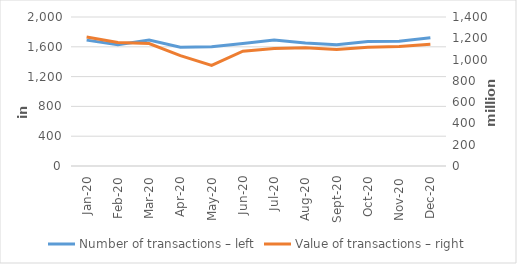
| Category | Number of transactions – left |
|---|---|
| 2020-01-01 | 1689658 |
| 2020-02-01 | 1628932 |
| 2020-03-01 | 1690846 |
| 2020-04-01 | 1593917 |
| 2020-05-01 | 1601244 |
| 2020-06-01 | 1645690 |
| 2020-07-01 | 1691157 |
| 2020-08-01 | 1649626 |
| 2020-09-01 | 1627483 |
| 2020-10-01 | 1672488 |
| 2020-11-01 | 1675992 |
| 2020-12-01 | 1722990 |